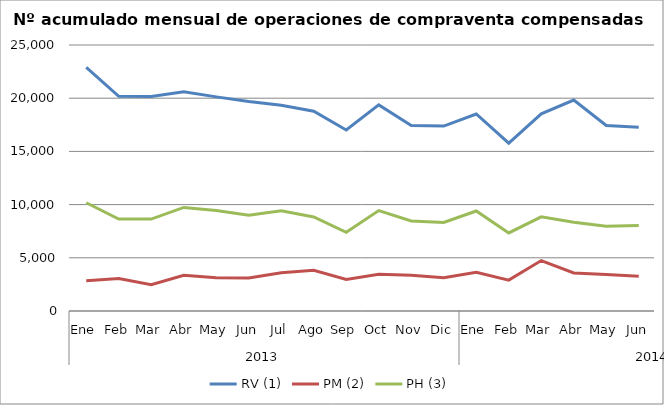
| Category | RV (1) | PM (2) | PH (3) |
|---|---|---|---|
| 0 | 22894 | 2853 | 10176 |
| 1 | 20174 | 3047 | 8641 |
| 2 | 20169 | 2472 | 8638 |
| 3 | 20616 | 3350 | 9736 |
| 4 | 20126 | 3117 | 9441 |
| 5 | 19686 | 3099 | 9000 |
| 6 | 19337 | 3588 | 9415 |
| 7 | 18769 | 3829 | 8838 |
| 8 | 17015 | 2969 | 7402 |
| 9 | 19371 | 3453 | 9435 |
| 10 | 17427 | 3359 | 8465 |
| 11 | 17377 | 3135 | 8315 |
| 12 | 18515 | 3629 | 9396 |
| 13 | 15776 | 2899 | 7337 |
| 14 | 18527 | 4739 | 8846 |
| 15 | 19824 | 3575 | 8345 |
| 16 | 17431 | 3429 | 7965 |
| 17 | 17272 | 3273 | 8041 |